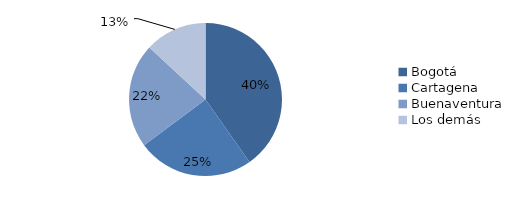
| Category | Series 0 |
|---|---|
| Bogotá | 1175.837 |
| Cartagena | 718.836 |
| Buenaventura | 644.525 |
| Los demás | 383.501 |